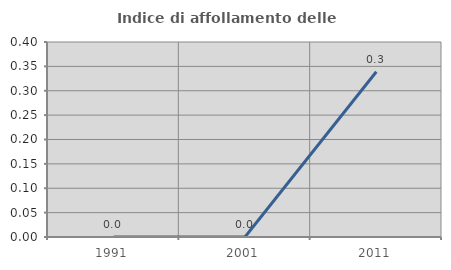
| Category | Indice di affollamento delle abitazioni  |
|---|---|
| 1991.0 | 0 |
| 2001.0 | 0 |
| 2011.0 | 0.339 |